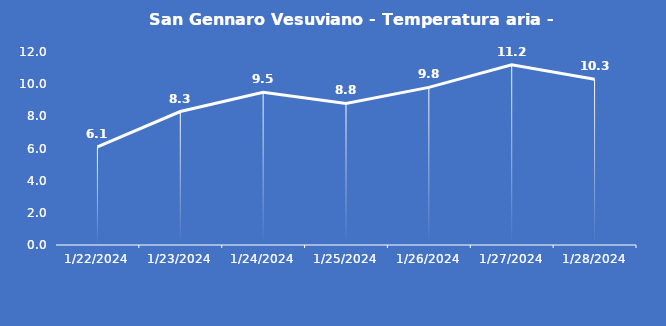
| Category | San Gennaro Vesuviano - Temperatura aria - Grezzo (°C) |
|---|---|
| 1/22/24 | 6.1 |
| 1/23/24 | 8.3 |
| 1/24/24 | 9.5 |
| 1/25/24 | 8.8 |
| 1/26/24 | 9.8 |
| 1/27/24 | 11.2 |
| 1/28/24 | 10.3 |